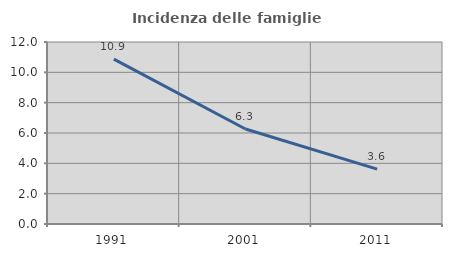
| Category | Incidenza delle famiglie numerose |
|---|---|
| 1991.0 | 10.874 |
| 2001.0 | 6.262 |
| 2011.0 | 3.619 |